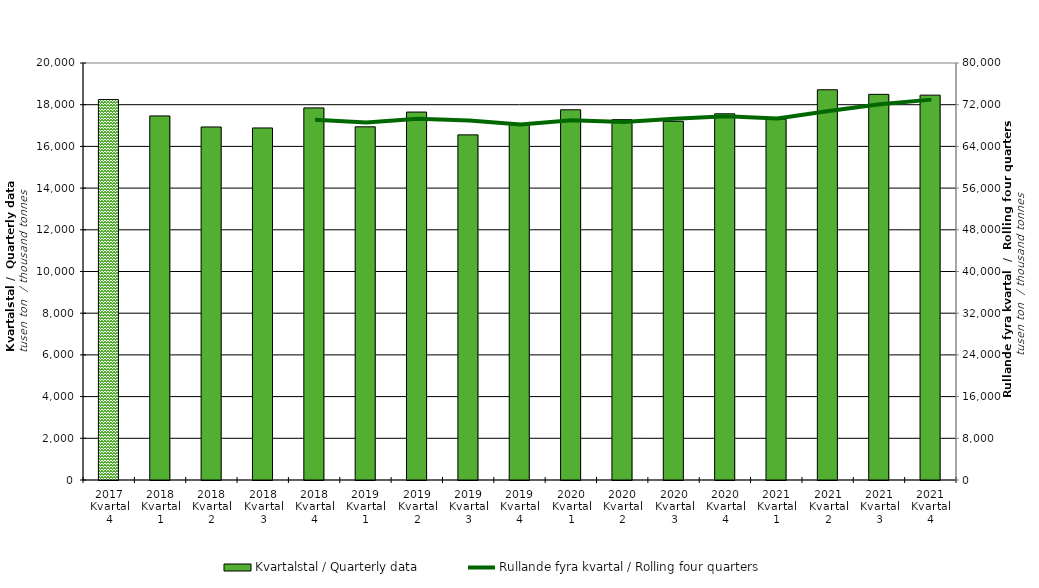
| Category | Kvartalstal / Quarterly data |
|---|---|
| 2017 Kvartal 4 | 18245.096 |
| 2018 Kvartal 1 | 17460.514 |
| 2018 Kvartal 2 | 16931.207 |
| 2018 Kvartal 3 | 16884.53 |
| 2018 Kvartal 4 | 17846.541 |
| 2019 Kvartal 1 | 16938.711 |
| 2019 Kvartal 2 | 17647.493 |
| 2019 Kvartal 3 | 16553.159 |
| 2019 Kvartal 4 | 17080.691 |
| 2020 Kvartal 1 | 17755.324 |
| 2020 Kvartal 2 | 17283.081 |
| 2020 Kvartal 3 | 17203.185 |
| 2020 Kvartal 4 | 17563.403 |
| 2021 Kvartal 1 | 17302.538 |
| 2021 Kvartal 2 | 18716.608 |
| 2021 Kvartal 3 | 18496.256 |
| 2021 Kvartal 4 | 18459.145 |